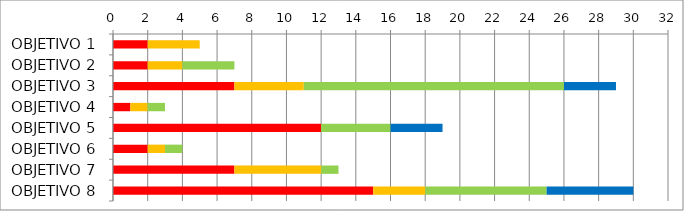
| Category | Series 1 | Series 2 | Series 3 | Series 4 | Series 5 |
|---|---|---|---|---|---|
| OBJETIVO 1 | 0 | 2 | 3 | 0 | 0 |
| OBJETIVO 2 | 0 | 2 | 2 | 3 | 0 |
| OBJETIVO 3 | 0 | 7 | 4 | 15 | 3 |
| OBJETIVO 4 | 0 | 1 | 1 | 1 | 0 |
| OBJETIVO 5 | 0 | 12 | 0 | 4 | 3 |
| OBJETIVO 6 | 0 | 2 | 1 | 1 | 0 |
| OBJETIVO 7 | 0 | 7 | 5 | 1 | 0 |
| OBJETIVO 8 | 0 | 15 | 3 | 7 | 5 |